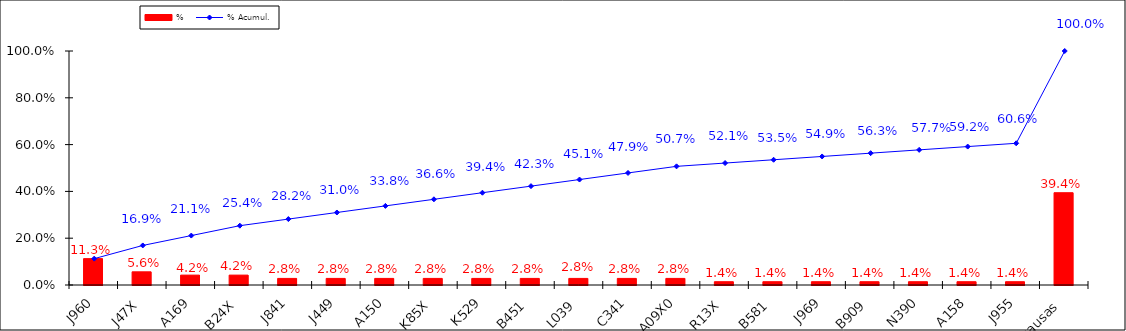
| Category | % |
|---|---|
| J960 | 0.113 |
| J47X | 0.056 |
| A169 | 0.042 |
| B24X | 0.042 |
| J841 | 0.028 |
| J449 | 0.028 |
| A150 | 0.028 |
| K85X | 0.028 |
| K529 | 0.028 |
| B451 | 0.028 |
| L039 | 0.028 |
| C341 | 0.028 |
| A09X0 | 0.028 |
| R13X | 0.014 |
| B581 | 0.014 |
| J969 | 0.014 |
| B909 | 0.014 |
| N390 | 0.014 |
| A158 | 0.014 |
| J955 | 0.014 |
| Otras causas | 0.394 |